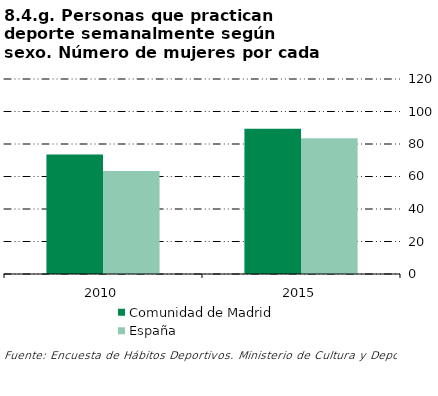
| Category | Comunidad de Madrid | España |
|---|---|---|
| 2010.0 | 73.535 | 63.436 |
| 2015.0 | 89.346 | 83.532 |